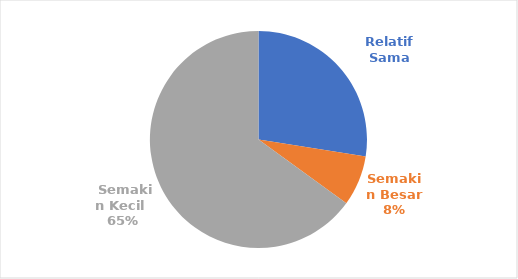
| Category | INDIKATOR UKURAN IKAN  |
|---|---|
| Relatif Sama | 11 |
| Semakin Besar | 3 |
|  Semakin Kecil  | 26 |